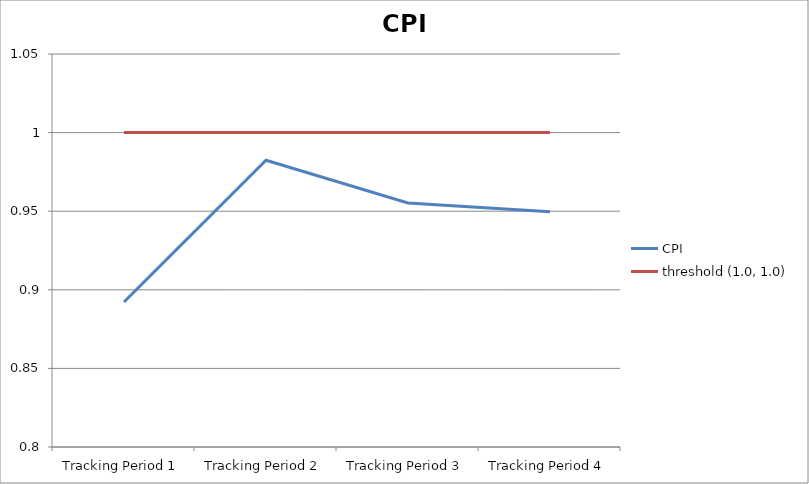
| Category | CPI | threshold (1.0, 1.0) |
|---|---|---|
| Tracking Period 1 | 0.892 | 1 |
| Tracking Period 2 | 0.982 | 1 |
| Tracking Period 3 | 0.955 | 1 |
| Tracking Period 4 | 0.95 | 1 |